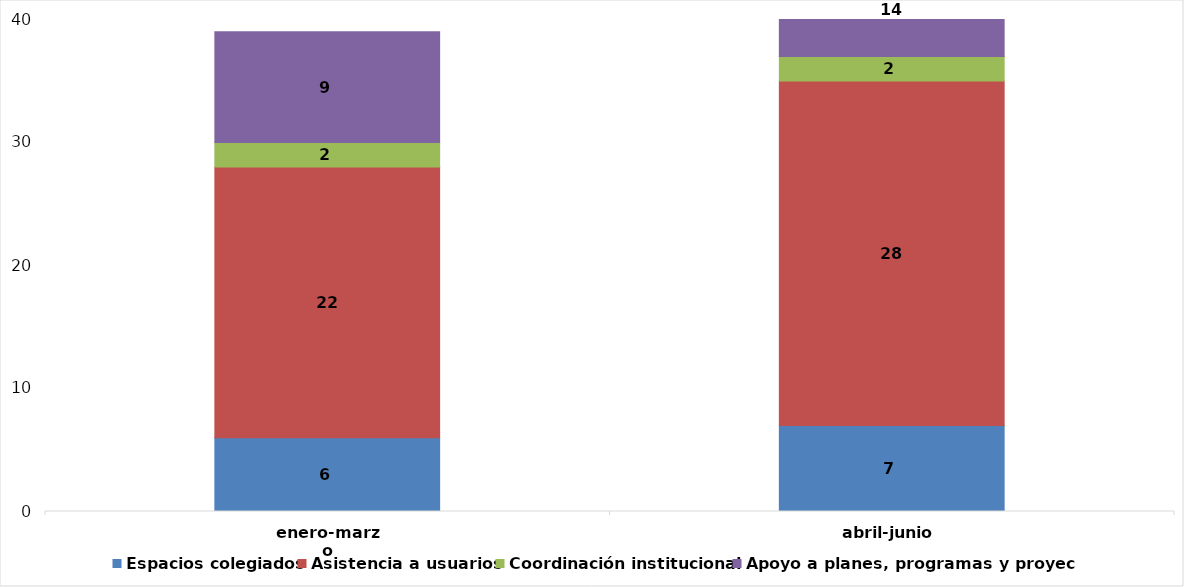
| Category | Espacios colegiados | Asistencia a usuarios  | Coordinación institucional  | Apoyo a planes, programas y proyectos |
|---|---|---|---|---|
| enero-marzo | 6 | 22 | 2 | 9 |
| abril-junio | 7 | 28 | 2 | 14 |